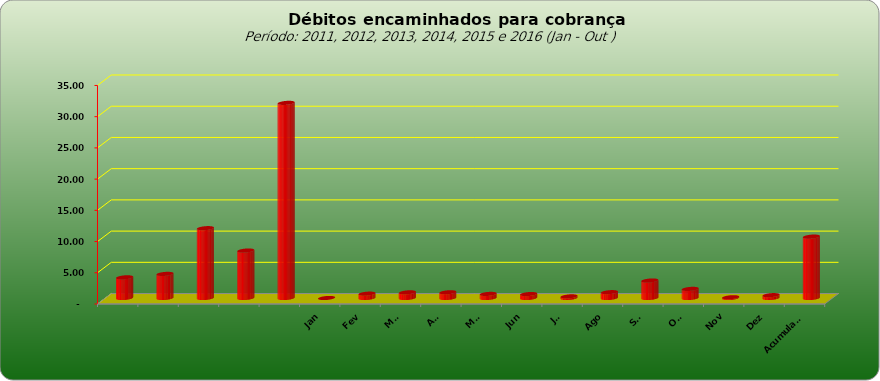
| Category |  3.309.443,02  |
|---|---|
|  | 3309443.02 |
|  | 3859728.44 |
|  | 11181928.25 |
|  | 7600526.01 |
|  | 31248623.5 |
| Jan | 0 |
| Fev | 695716.82 |
| Mar | 906394.22 |
| Abr | 915013.51 |
| Mai | 654375.79 |
| Jun | 631930.49 |
| Jul | 259089.26 |
| Ago | 932827.69 |
| Set | 2800571.52 |
| Out | 1458860.91 |
| Nov | 120510.29 |
| Dez | 454907.84 |
| Acumulado | 9830198.34 |